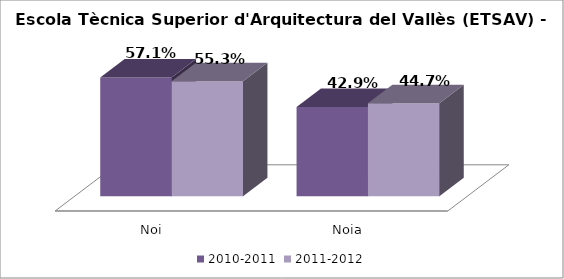
| Category | 2010-2011 | 2011-2012 |
|---|---|---|
| Noi | 0.571 | 0.553 |
| Noia | 0.429 | 0.447 |